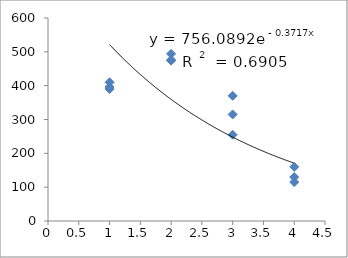
| Category | Series 0 |
|---|---|
| 1.0 | 396 |
| 1.0 | 410 |
| 1.0 | 390 |
| 2.0 | 474 |
| 2.0 | 494 |
| 2.0 | 476 |
| 3.0 | 315 |
| 3.0 | 370 |
| 3.0 | 255 |
| 4.0 | 130 |
| 4.0 | 115 |
| 4.0 | 160 |